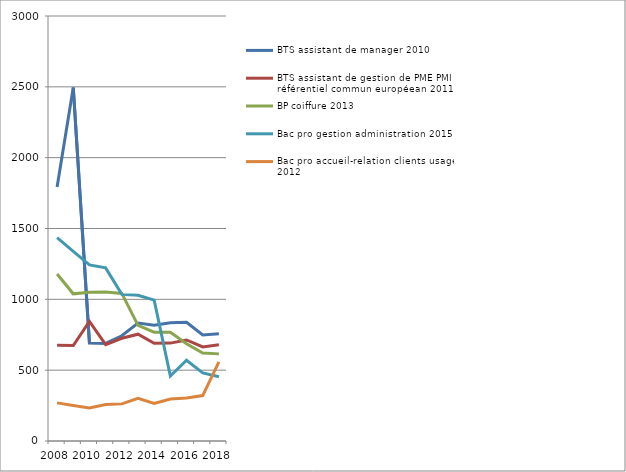
| Category | BTS assistant de manager 2010 | BTS assistant de gestion de PME PMI à référentiel commun européean 2011 | BP coiffure 2013 | Bac pro gestion administration 2015 | Bac pro accueil-relation clients usagers 2012 |
|---|---|---|---|---|---|
| 2008.0 | 1793 | 676 | 1179 | 1435 | 269 |
| 2009.0 | 2495 | 674 | 1039 | 1338 | 251 |
| 2010.0 | 691 | 844 | 1050 | 1243 | 233 |
| 2011.0 | 689 | 680 | 1052 | 1222 | 258 |
| 2012.0 | 743 | 725 | 1042 | 1035 | 262 |
| 2013.0 | 833 | 754 | 816 | 1029 | 302 |
| 2014.0 | 818 | 690 | 768 | 994 | 265 |
| 2015.0 | 835 | 691 | 768 | 459 | 296 |
| 2016.0 | 838 | 713 | 687 | 570 | 303 |
| 2017.0 | 749 | 664 | 621 | 481 | 321 |
| 2018.0 | 757 | 680 | 615 | 454 | 559 |